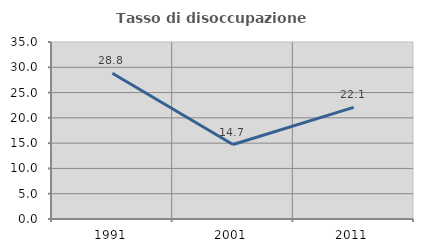
| Category | Tasso di disoccupazione giovanile  |
|---|---|
| 1991.0 | 28.835 |
| 2001.0 | 14.722 |
| 2011.0 | 22.072 |